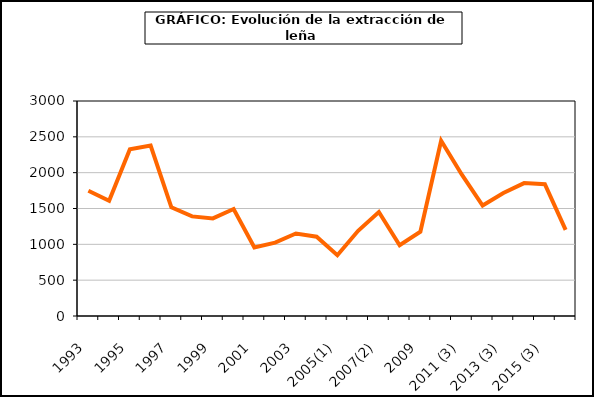
| Category | Series 0 |
|---|---|
| 1993 | 1748 |
| 1994 | 1609 |
| 1995 | 2325 |
| 1996 | 2377 |
| 1997 | 1516 |
| 1998 | 1390 |
| 1999 | 1362 |
| 2000 | 1493 |
| 2001 | 955 |
| 2002 | 1024 |
| 2003 | 1151 |
| 2004 | 1106 |
| 2005(1) | 848 |
| 2006 | 1189 |
| 2007(2) | 1451 |
| 2008 | 988 |
| 2009 | 1175.249 |
| 2010 (3) | 2444.913 |
| 2011 (3) | 1971.599 |
| 2012 (3) | 1541.774 |
| 2013 (3) | 1716.337 |
| 2014 (3) | 1854.045 |
| 2015 (3) | 1839.98 |
| 2016 | 1200.867 |